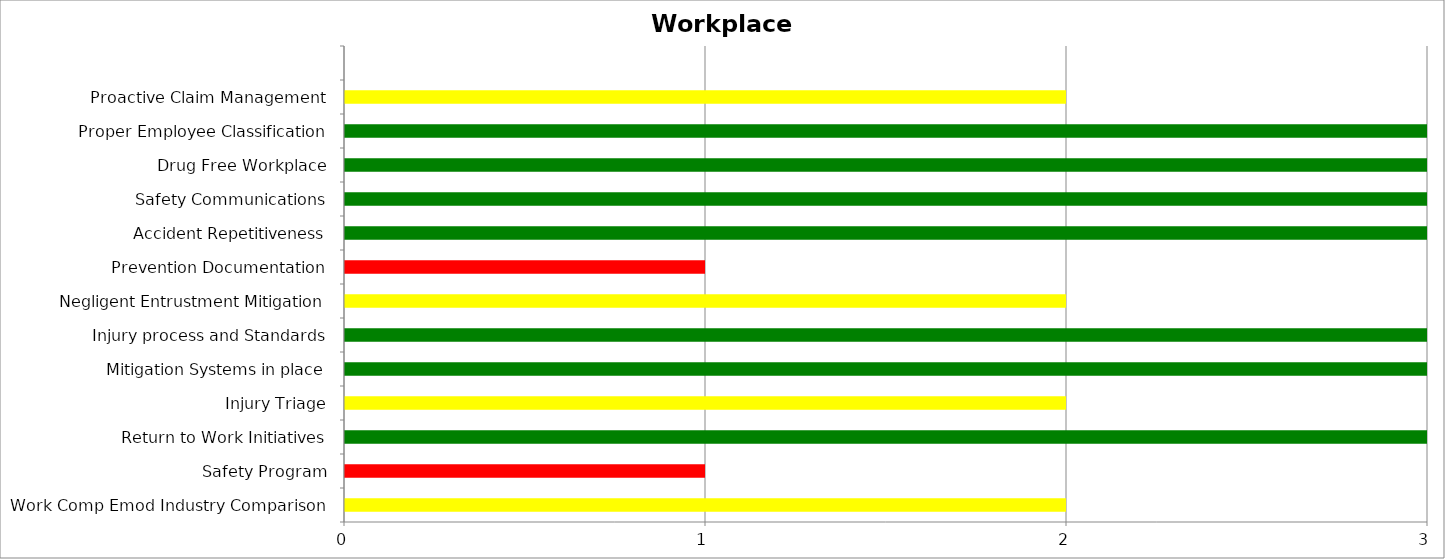
| Category | Low | Medium | High |
|---|---|---|---|
| Work Comp Emod Industry Comparison | 0 | 2 | 0 |
| Safety Program | 0 | 0 | 1 |
| Return to Work Initiatives | 3 | 0 | 0 |
| Injury Triage | 0 | 2 | 0 |
| Mitigation Systems in place | 3 | 0 | 0 |
| Injury process and Standards | 3 | 0 | 0 |
| Negligent Entrustment Mitigation | 0 | 2 | 0 |
| Prevention Documentation | 0 | 0 | 1 |
| Accident Repetitiveness | 3 | 0 | 0 |
| Safety Communications | 3 | 0 | 0 |
| Drug Free Workplace | 3 | 0 | 0 |
| Proper Employee Classification | 3 | 0 | 0 |
| Proactive Claim Management | 0 | 2 | 0 |